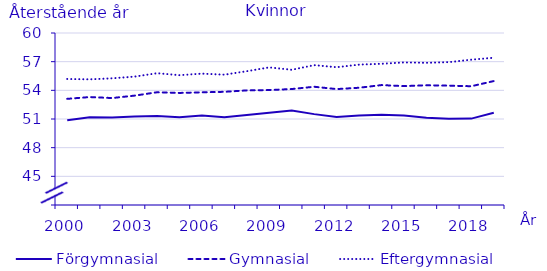
| Category | Förgymnasial | Gymnasial | Eftergymnasial |
|---|---|---|---|
| 2000.0 | 50.875 | 53.108 | 55.187 |
| 2001.0 | 51.177 | 53.296 | 55.151 |
| 2002.0 | 51.161 | 53.193 | 55.256 |
| 2003.0 | 51.259 | 53.446 | 55.434 |
| 2004.0 | 51.313 | 53.797 | 55.792 |
| 2005.0 | 51.176 | 53.728 | 55.586 |
| 2006.0 | 51.361 | 53.793 | 55.749 |
| 2007.0 | 51.188 | 53.845 | 55.637 |
| 2008.0 | 51.414 | 53.993 | 56.003 |
| 2009.0 | 51.651 | 54.031 | 56.399 |
| 2010.0 | 51.886 | 54.134 | 56.151 |
| 2011.0 | 51.511 | 54.375 | 56.635 |
| 2012.0 | 51.22 | 54.13 | 56.42 |
| 2013.0 | 51.37 | 54.27 | 56.69 |
| 2014.0 | 51.45 | 54.55 | 56.78 |
| 2015.0 | 51.36 | 54.44 | 56.92 |
| 2016.0 | 51.12 | 54.53 | 56.88 |
| 2017.0 | 51.03 | 54.49 | 56.95 |
| 2018.0 | 51.04 | 54.43 | 57.21 |
| 2019.0 | 51.66 | 54.97 | 57.41 |